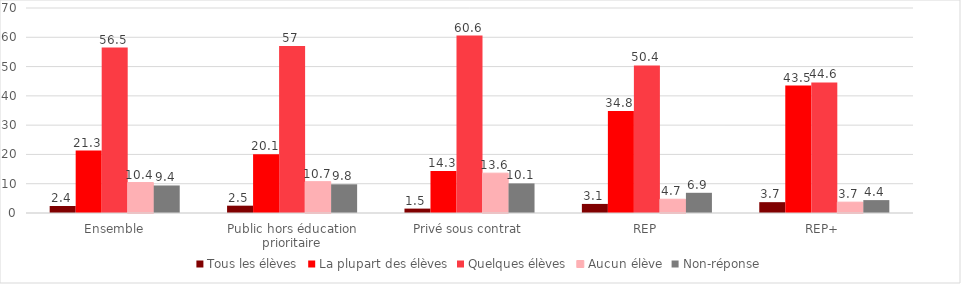
| Category | Tous les élèves | La plupart des élèves | Quelques élèves | Aucun élève | Non-réponse |
|---|---|---|---|---|---|
| Ensemble | 2.4 | 21.3 | 56.5 | 10.4 | 9.4 |
| Public hors éducation prioritaire | 2.5 | 20.1 | 57 | 10.7 | 9.8 |
| Privé sous contrat | 1.5 | 14.3 | 60.6 | 13.6 | 10.1 |
| REP | 3.1 | 34.8 | 50.4 | 4.7 | 6.9 |
| REP+ | 3.7 | 43.5 | 44.6 | 3.7 | 4.4 |